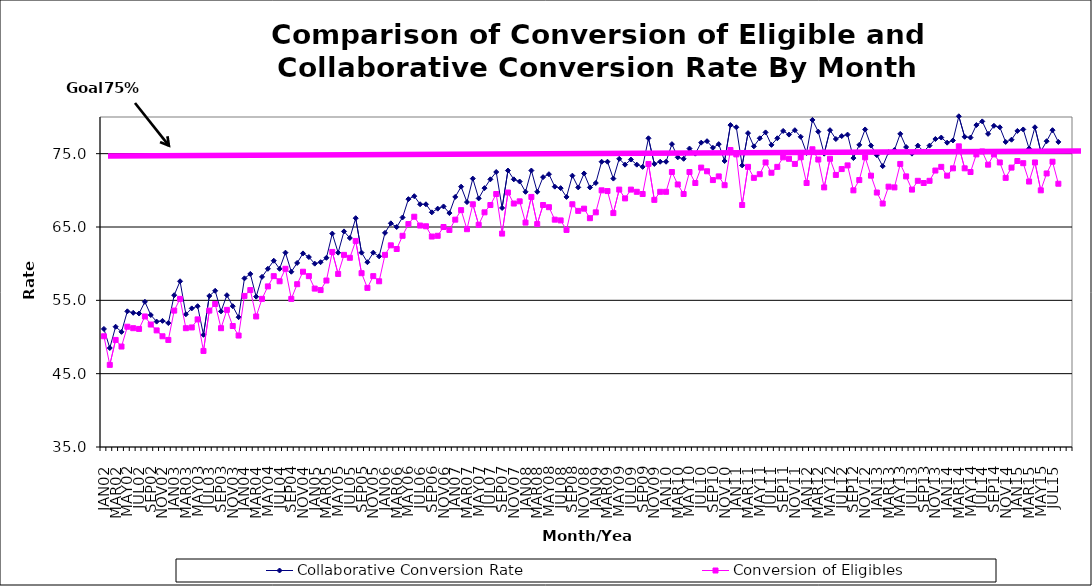
| Category | Collaborative Conversion Rate | Conversion of Eligibles |
|---|---|---|
| JAN02 | 51.1 | 50.1 |
| FEB02 | 48.5 | 46.2 |
| MAR02 | 51.4 | 49.6 |
| APR02 | 50.7 | 48.7 |
| MAY02 | 53.5 | 51.4 |
| JUN02 | 53.3 | 51.2 |
| JUL02 | 53.2 | 51.1 |
| AUG02 | 54.8 | 52.8 |
| SEP02 | 53 | 51.7 |
| OCT02 | 52.1 | 50.9 |
| NOV02 | 52.2 | 50.1 |
| DEC02 | 51.9 | 49.6 |
| JAN03 | 55.7 | 53.6 |
| FEB03 | 57.6 | 55.2 |
| MAR03 | 53.1 | 51.2 |
| APR03 | 53.9 | 51.3 |
| MAY03 | 54.2 | 52.4 |
| JUN03 | 50.3 | 48.1 |
| JUL03 | 55.6 | 53.6 |
| AUG03 | 56.3 | 54.5 |
| SEP03 | 53.5 | 51.2 |
| OCT03 | 55.7 | 53.7 |
| NOV03 | 54.2 | 51.5 |
| DEC03 | 52.7 | 50.2 |
| JAN04 | 58 | 55.6 |
| FEB04 | 58.6 | 56.4 |
| MAR04 | 55.5 | 52.8 |
| APR04 | 58.2 | 55.2 |
| MAY04 | 59.3 | 56.9 |
| JUN04 | 60.4 | 58.3 |
| JUL04 | 59.3 | 57.6 |
| AUG04 | 61.5 | 59.3 |
| SEP04 | 58.9 | 55.2 |
| OCT04 | 60.1 | 57.2 |
| NOV04 | 61.4 | 58.9 |
| DEC04 | 60.9 | 58.3 |
| JAN05 | 60 | 56.6 |
| FEB05 | 60.2 | 56.4 |
| MAR05 | 60.8 | 57.7 |
| APR05 | 64.1 | 61.6 |
| MAY05 | 61.5 | 58.6 |
| JUN05 | 64.4 | 61.2 |
| JUL05 | 63.5 | 60.8 |
| AUG05 | 66.2 | 63.1 |
| SEP05 | 61.5 | 58.7 |
| OCT05 | 60.2 | 56.7 |
| NOV05 | 61.5 | 58.3 |
| DEC05 | 61 | 57.6 |
| JAN06 | 64.2 | 61.2 |
| FEB06 | 65.5 | 62.5 |
| MAR06 | 65 | 62 |
| APR06 | 66.3 | 63.8 |
| MAY06 | 68.8 | 65.4 |
| JUN06 | 69.2 | 66.4 |
| JUL06 | 68.1 | 65.2 |
| AUG06 | 68.1 | 65.1 |
| SEP06 | 67 | 63.7 |
| OCT06 | 67.5 | 63.8 |
| NOV06 | 67.8 | 65 |
| DEC06 | 66.9 | 64.6 |
| JAN07 | 69.1 | 66 |
| FEB07 | 70.5 | 67.3 |
| MAR07 | 68.4 | 64.7 |
| APR07 | 71.6 | 68.1 |
| MAY07 | 68.9 | 65.3 |
| JUN07 | 70.3 | 67 |
| JUL07 | 71.5 | 68 |
| AUG07 | 72.5 | 69.5 |
| SEP07 | 67.6 | 64.1 |
| OCT07 | 72.7 | 69.7 |
| NOV07 | 71.5 | 68.2 |
| DEC07 | 71.2 | 68.5 |
| JAN08 | 69.8 | 65.6 |
| FEB08 | 72.7 | 69.1 |
| MAR08 | 69.8 | 65.4 |
| APR08 | 71.8 | 68 |
| MAY08 | 72.2 | 67.7 |
| JUN08 | 70.5 | 66 |
| JUL08 | 70.3 | 65.9 |
| AUG08 | 69.1 | 64.6 |
| SEP08 | 72 | 68.1 |
| OCT08 | 70.4 | 67.2 |
| NOV08 | 72.3 | 67.5 |
| DEC08 | 70.4 | 66.2 |
| JAN09 | 71 | 67 |
| FEB09 | 73.9 | 70 |
| MAR09 | 73.9 | 69.9 |
| APR09 | 71.6 | 66.9 |
| MAY09 | 74.3 | 70.1 |
| JUN09 | 73.5 | 68.9 |
| JUL09 | 74.2 | 70.1 |
| AUG09 | 73.5 | 69.8 |
| SEP09 | 73.2 | 69.5 |
| OCT09 | 77.1 | 73.6 |
| NOV09 | 73.6 | 68.7 |
| DEC09 | 73.9 | 69.8 |
| JAN10 | 73.9 | 69.8 |
| FEB10 | 76.3 | 72.5 |
| MAR10 | 74.5 | 70.8 |
| APR10 | 74.3 | 69.5 |
| MAY10 | 75.7 | 72.5 |
| JUN10 | 75 | 71 |
| JUL10 | 76.5 | 73.1 |
| AUG10 | 76.7 | 72.6 |
| SEP10 | 75.8 | 71.4 |
| OCT10 | 76.3 | 71.9 |
| NOV10 | 74 | 70.7 |
| DEC10 | 78.9 | 75.5 |
| JAN11 | 78.6 | 74.9 |
| FEB11 | 73.4 | 68 |
| MAR11 | 77.8 | 73.2 |
| APR11 | 76 | 71.7 |
| MAY11 | 77.1 | 72.2 |
| JUN11 | 77.9 | 73.8 |
| JUL11 | 76.2 | 72.4 |
| AUG11 | 77.1 | 73.2 |
| SEP11 | 78.1 | 74.5 |
| OCT11 | 77.6 | 74.3 |
| NOV11 | 78.2 | 73.6 |
| DEC11 | 77.3 | 74.5 |
| JAN12 | 75.1 | 71 |
| FEB12 | 79.6 | 75.6 |
| MAR12 | 78 | 74.2 |
| APR12 | 75 | 70.4 |
| MAY12 | 78.2 | 74.3 |
| JUN12 | 77 | 72.1 |
| JUL12 | 77.4 | 72.9 |
| AUG12 | 77.6 | 73.4 |
| SEP12 | 74.4 | 70 |
| OCT12 | 76.2 | 71.4 |
| NOV12 | 78.3 | 74.5 |
| DEC12 | 76.1 | 72 |
| JAN13 | 74.8 | 69.7 |
| FEB13 | 73.3 | 68.2 |
| MAR13 | 75.2 | 70.5 |
| APR13 | 75.5 | 70.4 |
| MAY13 | 77.7 | 73.6 |
| JUN13 | 75.9 | 71.9 |
| JUL13 | 75 | 70.1 |
| AUG13 | 76.1 | 71.3 |
| SEP13 | 75.3 | 71 |
| OCT13 | 76.1 | 71.3 |
| NOV13 | 77 | 72.7 |
| DEC13 | 77.2 | 73.2 |
| JAN14 | 76.5 | 72 |
| FEB14 | 76.8 | 73 |
| MAR14 | 80.1 | 76 |
| APR14 | 77.3 | 73 |
| MAY14 | 77.2 | 72.5 |
| JUN14 | 78.9 | 74.9 |
| JUL14 | 79.4 | 75.3 |
| AUG14 | 77.7 | 73.5 |
| SEP14 | 78.8 | 74.9 |
| OCT14 | 78.6 | 73.8 |
| NOV14 | 76.6 | 71.7 |
| DEC14 | 76.9 | 73.1 |
| JAN15 | 78.1 | 74 |
| FEB15 | 78.3 | 73.7 |
| MAR15 | 75.7 | 71.2 |
| APR15 | 78.6 | 73.8 |
| MAY15 | 75.3 | 70 |
| JUN15 | 76.7 | 72.3 |
| JUL15 | 78.2 | 73.9 |
| AUG15 | 76.6 | 70.9 |